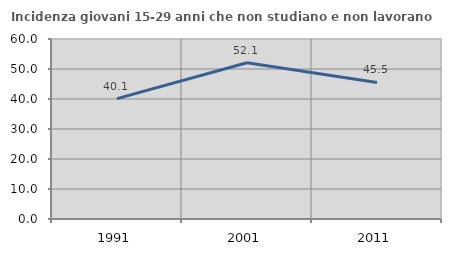
| Category | Incidenza giovani 15-29 anni che non studiano e non lavorano  |
|---|---|
| 1991.0 | 40.11 |
| 2001.0 | 52.064 |
| 2011.0 | 45.515 |